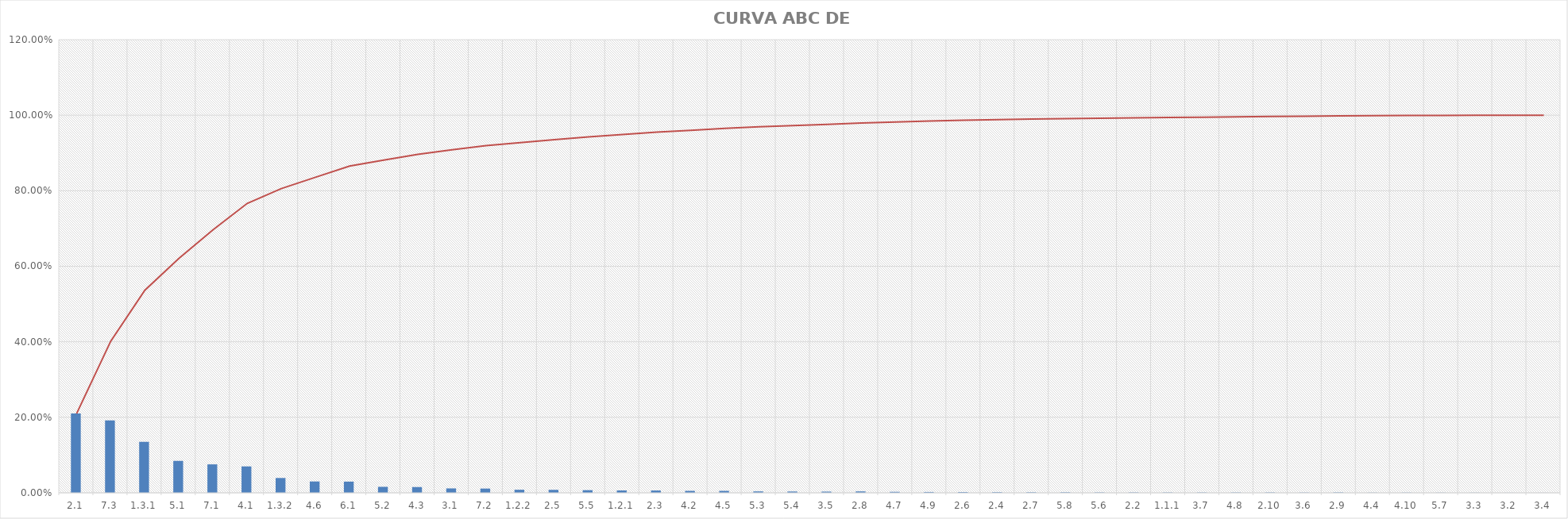
| Category | PARTICIPAÇÃO INDIVIDUAL |
|---|---|
| 2.1 | 0.21 |
| 7.3 | 0.192 |
| 1.3.1 | 0.135 |
| 5.1 | 0.085 |
| 7.1 | 0.075 |
| 4.1 | 0.07 |
| 1.3.2 | 0.039 |
| 4.6 | 0.03 |
| 6.1 | 0.03 |
| 5.2 | 0.016 |
| 4.3 | 0.015 |
| 3.1 | 0.012 |
| 7.2 | 0.011 |
| 1.2.2 | 0.008 |
| 2.5 | 0.008 |
| 5.5 | 0.007 |
| 1.2.1 | 0.006 |
| 2.3 | 0.006 |
| 4.2 | 0.005 |
| 4.5 | 0.005 |
| 5.3 | 0.004 |
| 5.4 | 0.003 |
| 3.5 | 0.003 |
| 2.8 | 0.004 |
| 4.7 | 0.003 |
| 4.9 | 0.002 |
| 2.6 | 0.002 |
| 2.4 | 0.002 |
| 2.7 | 0.001 |
| 5.8 | 0.001 |
| 5.6 | 0.001 |
| 2.2 | 0.001 |
| 1.1.1 | 0.001 |
| 3.7 | 0.001 |
| 4.8 | 0.001 |
| 2.10 | 0.001 |
| 3.6 | 0.001 |
| 2.9 | 0.001 |
| 4.4 | 0 |
| 4.10 | 0 |
| 5.7 | 0 |
| 3.3 | 0 |
| 3.2 | 0 |
| 3.4 | 0 |